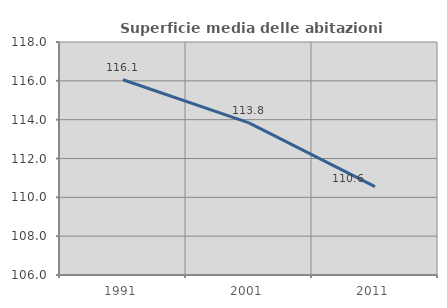
| Category | Superficie media delle abitazioni occupate |
|---|---|
| 1991.0 | 116.058 |
| 2001.0 | 113.834 |
| 2011.0 | 110.552 |